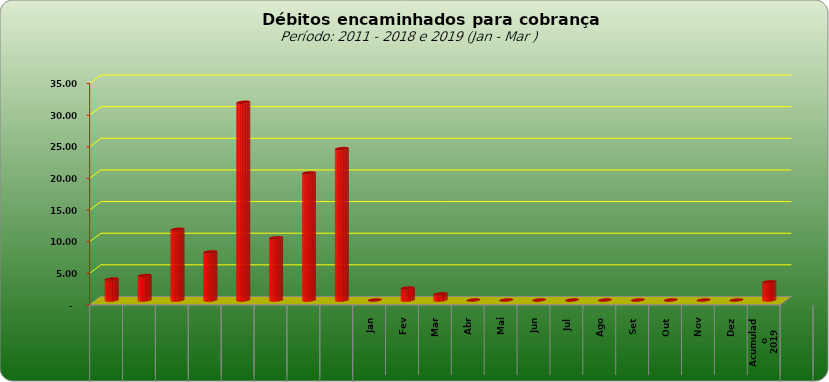
| Category |  3.309.443,02   3.859.728,44   11.181.928,25   7.600.526,01   31.248.623,50   9.830.198,34   20.083.556,95   23.931.734,08   -     1.897.202,11   974.309,37   -     -     -     -     -     -     -     -     -     2.871.511,48  |
|---|---|
| 0 | 3309443.02 |
| 1 | 3859728.44 |
| 2 | 11181928.25 |
| 3 | 7600526.01 |
| 4 | 31248623.5 |
| 5 | 9830198.34 |
| 6 | 20083556.95 |
| 7 | 23931734.08 |
| 8 | 0 |
| 9 | 1897202.11 |
| 10 | 974309.37 |
| 11 | 0 |
| 12 | 0 |
| 13 | 0 |
| 14 | 0 |
| 15 | 0 |
| 16 | 0 |
| 17 | 0 |
| 18 | 0 |
| 19 | 0 |
| 20 | 2871511.48 |